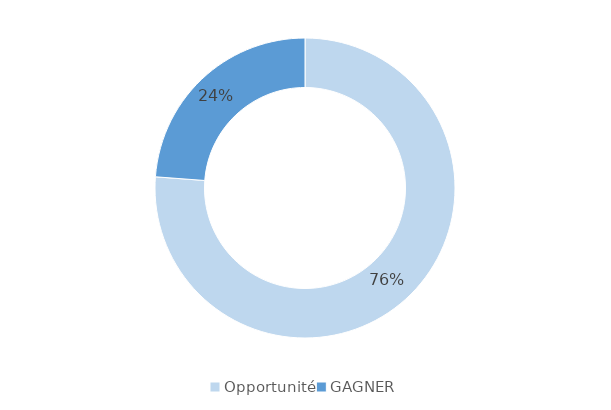
| Category | Series 0 |
|---|---|
| Opportunité | 16 |
| GAGNER | 5 |